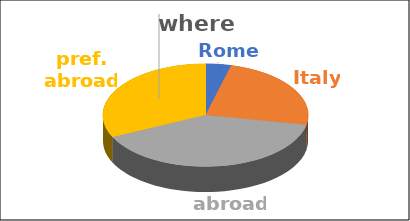
| Category | where | Series 1 | Series 2 | Series 3 | Series 4 |
|---|---|---|---|---|---|
| Rome | 0.04 |  |  |  |  |
| Italy | 0.24 |  |  |  |  |
| abroad | 0.4 |  |  |  |  |
| pref. abroad | 0.32 |  |  |  |  |